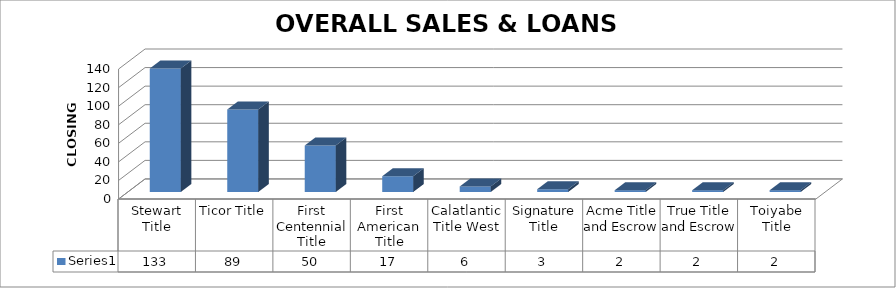
| Category | Series 0 |
|---|---|
| Stewart Title | 133 |
| Ticor Title | 89 |
| First Centennial Title | 50 |
| First American Title | 17 |
| Calatlantic Title West | 6 |
| Signature Title | 3 |
| Acme Title and Escrow | 2 |
| True Title and Escrow | 2 |
| Toiyabe Title | 2 |